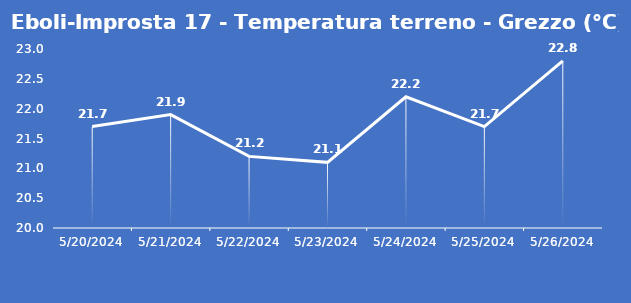
| Category | Eboli-Improsta 17 - Temperatura terreno - Grezzo (°C) |
|---|---|
| 5/20/24 | 21.7 |
| 5/21/24 | 21.9 |
| 5/22/24 | 21.2 |
| 5/23/24 | 21.1 |
| 5/24/24 | 22.2 |
| 5/25/24 | 21.7 |
| 5/26/24 | 22.8 |